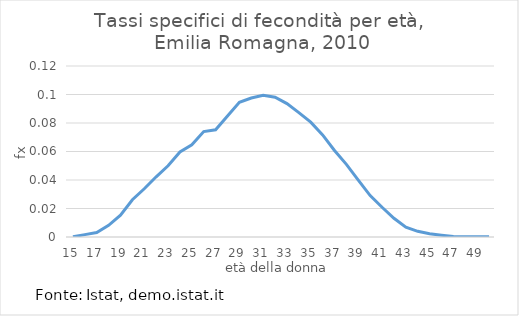
| Category | Series 0 |
|---|---|
| 15.0 | 0 |
| 16.0 | 0.002 |
| 17.0 | 0.003 |
| 18.0 | 0.008 |
| 19.0 | 0.015 |
| 20.0 | 0.026 |
| 21.0 | 0.034 |
| 22.0 | 0.042 |
| 23.0 | 0.05 |
| 24.0 | 0.06 |
| 25.0 | 0.065 |
| 26.0 | 0.074 |
| 27.0 | 0.075 |
| 28.0 | 0.085 |
| 29.0 | 0.095 |
| 30.0 | 0.098 |
| 31.0 | 0.099 |
| 32.0 | 0.098 |
| 33.0 | 0.094 |
| 34.0 | 0.087 |
| 35.0 | 0.081 |
| 36.0 | 0.072 |
| 37.0 | 0.061 |
| 38.0 | 0.051 |
| 39.0 | 0.04 |
| 40.0 | 0.029 |
| 41.0 | 0.021 |
| 42.0 | 0.013 |
| 43.0 | 0.007 |
| 44.0 | 0.004 |
| 45.0 | 0.002 |
| 46.0 | 0.001 |
| 47.0 | 0 |
| 48.0 | 0 |
| 49.0 | 0 |
| 50.0 | 0 |